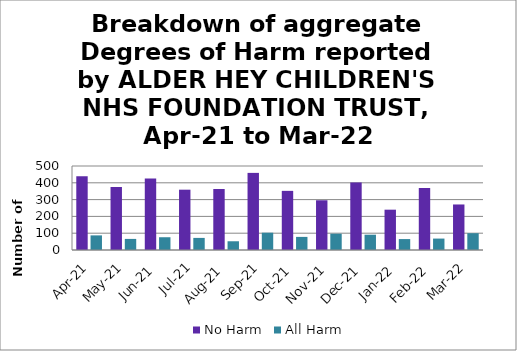
| Category | No Harm | All Harm |
|---|---|---|
| Apr-21 | 439 | 87 |
| May-21 | 375 | 66 |
| Jun-21 | 425 | 76 |
| Jul-21 | 359 | 72 |
| Aug-21 | 363 | 52 |
| Sep-21 | 459 | 103 |
| Oct-21 | 352 | 78 |
| Nov-21 | 296 | 97 |
| Dec-21 | 402 | 91 |
| Jan-22 | 240 | 65 |
| Feb-22 | 369 | 68 |
| Mar-22 | 271 | 100 |